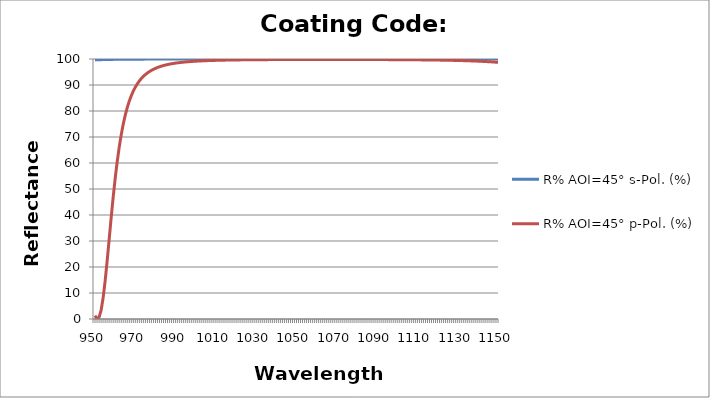
| Category | R% AOI=45° s-Pol. (%) | R% AOI=45° p-Pol. (%) |
|---|---|---|
| 950.0 | 99.659 | 1.313 |
| 951.0 | 99.693 | 0.078 |
| 952.0 | 99.723 | 0.639 |
| 953.0 | 99.749 | 3.265 |
| 954.0 | 99.772 | 7.958 |
| 955.0 | 99.793 | 14.423 |
| 956.0 | 99.811 | 22.128 |
| 957.0 | 99.827 | 30.446 |
| 958.0 | 99.842 | 38.796 |
| 959.0 | 99.854 | 46.736 |
| 960.0 | 99.866 | 53.988 |
| 961.0 | 99.876 | 60.426 |
| 962.0 | 99.886 | 66.026 |
| 963.0 | 99.894 | 70.831 |
| 964.0 | 99.902 | 74.921 |
| 965.0 | 99.909 | 78.384 |
| 966.0 | 99.915 | 81.311 |
| 967.0 | 99.921 | 83.784 |
| 968.0 | 99.926 | 85.877 |
| 969.0 | 99.931 | 87.652 |
| 970.0 | 99.935 | 89.16 |
| 971.0 | 99.939 | 90.447 |
| 972.0 | 99.943 | 91.549 |
| 973.0 | 99.946 | 92.495 |
| 974.0 | 99.95 | 93.312 |
| 975.0 | 99.952 | 94.018 |
| 976.0 | 99.955 | 94.631 |
| 977.0 | 99.958 | 95.166 |
| 978.0 | 99.96 | 95.634 |
| 979.0 | 99.962 | 96.045 |
| 980.0 | 99.964 | 96.406 |
| 981.0 | 99.966 | 96.726 |
| 982.0 | 99.967 | 97.009 |
| 983.0 | 99.969 | 97.26 |
| 984.0 | 99.97 | 97.485 |
| 985.0 | 99.972 | 97.685 |
| 986.0 | 99.973 | 97.864 |
| 987.0 | 99.974 | 98.026 |
| 988.0 | 99.975 | 98.171 |
| 989.0 | 99.976 | 98.302 |
| 990.0 | 99.977 | 98.42 |
| 991.0 | 99.978 | 98.527 |
| 992.0 | 99.979 | 98.625 |
| 993.0 | 99.98 | 98.714 |
| 994.0 | 99.981 | 98.794 |
| 995.0 | 99.981 | 98.868 |
| 996.0 | 99.982 | 98.936 |
| 997.0 | 99.983 | 98.998 |
| 998.0 | 99.983 | 99.055 |
| 999.0 | 99.984 | 99.107 |
| 1000.0 | 99.984 | 99.156 |
| 1001.0 | 99.985 | 99.2 |
| 1002.0 | 99.985 | 99.241 |
| 1003.0 | 99.986 | 99.279 |
| 1004.0 | 99.986 | 99.314 |
| 1005.0 | 99.987 | 99.347 |
| 1006.0 | 99.987 | 99.377 |
| 1007.0 | 99.987 | 99.405 |
| 1008.0 | 99.988 | 99.431 |
| 1009.0 | 99.988 | 99.456 |
| 1010.0 | 99.988 | 99.478 |
| 1011.0 | 99.989 | 99.5 |
| 1012.0 | 99.989 | 99.52 |
| 1013.0 | 99.989 | 99.538 |
| 1014.0 | 99.99 | 99.555 |
| 1015.0 | 99.99 | 99.572 |
| 1016.0 | 99.99 | 99.587 |
| 1017.0 | 99.99 | 99.601 |
| 1018.0 | 99.99 | 99.615 |
| 1019.0 | 99.991 | 99.627 |
| 1020.0 | 99.991 | 99.639 |
| 1021.0 | 99.991 | 99.65 |
| 1022.0 | 99.991 | 99.661 |
| 1023.0 | 99.991 | 99.671 |
| 1024.0 | 99.992 | 99.68 |
| 1025.0 | 99.992 | 99.689 |
| 1026.0 | 99.992 | 99.697 |
| 1027.0 | 99.992 | 99.705 |
| 1028.0 | 99.992 | 99.712 |
| 1029.0 | 99.992 | 99.719 |
| 1030.0 | 99.992 | 99.726 |
| 1031.0 | 99.992 | 99.732 |
| 1032.0 | 99.992 | 99.738 |
| 1033.0 | 99.993 | 99.743 |
| 1034.0 | 99.993 | 99.749 |
| 1035.0 | 99.993 | 99.754 |
| 1036.0 | 99.993 | 99.758 |
| 1037.0 | 99.993 | 99.763 |
| 1038.0 | 99.993 | 99.767 |
| 1039.0 | 99.993 | 99.771 |
| 1040.0 | 99.993 | 99.774 |
| 1041.0 | 99.993 | 99.778 |
| 1042.0 | 99.993 | 99.781 |
| 1043.0 | 99.993 | 99.784 |
| 1044.0 | 99.994 | 99.787 |
| 1045.0 | 99.994 | 99.79 |
| 1046.0 | 99.994 | 99.792 |
| 1047.0 | 99.994 | 99.794 |
| 1048.0 | 99.994 | 99.797 |
| 1049.0 | 99.994 | 99.799 |
| 1050.0 | 99.994 | 99.8 |
| 1051.0 | 99.994 | 99.802 |
| 1052.0 | 99.994 | 99.804 |
| 1053.0 | 99.994 | 99.805 |
| 1054.0 | 99.994 | 99.807 |
| 1055.0 | 99.994 | 99.808 |
| 1056.0 | 99.994 | 99.809 |
| 1057.0 | 99.994 | 99.81 |
| 1058.0 | 99.994 | 99.811 |
| 1059.0 | 99.994 | 99.811 |
| 1060.0 | 99.994 | 99.812 |
| 1061.0 | 99.994 | 99.812 |
| 1062.0 | 99.994 | 99.813 |
| 1063.0 | 99.994 | 99.813 |
| 1064.0 | 99.994 | 99.813 |
| 1065.0 | 99.994 | 99.813 |
| 1066.0 | 99.994 | 99.813 |
| 1067.0 | 99.994 | 99.813 |
| 1068.0 | 99.994 | 99.813 |
| 1069.0 | 99.994 | 99.812 |
| 1070.0 | 99.994 | 99.812 |
| 1071.0 | 99.994 | 99.812 |
| 1072.0 | 99.994 | 99.811 |
| 1073.0 | 99.994 | 99.81 |
| 1074.0 | 99.994 | 99.809 |
| 1075.0 | 99.994 | 99.808 |
| 1076.0 | 99.994 | 99.807 |
| 1077.0 | 99.994 | 99.806 |
| 1078.0 | 99.994 | 99.804 |
| 1079.0 | 99.994 | 99.803 |
| 1080.0 | 99.994 | 99.801 |
| 1081.0 | 99.994 | 99.8 |
| 1082.0 | 99.994 | 99.798 |
| 1083.0 | 99.994 | 99.796 |
| 1084.0 | 99.994 | 99.794 |
| 1085.0 | 99.994 | 99.791 |
| 1086.0 | 99.994 | 99.789 |
| 1087.0 | 99.994 | 99.786 |
| 1088.0 | 99.994 | 99.784 |
| 1089.0 | 99.993 | 99.781 |
| 1090.0 | 99.993 | 99.778 |
| 1091.0 | 99.993 | 99.775 |
| 1092.0 | 99.993 | 99.772 |
| 1093.0 | 99.993 | 99.768 |
| 1094.0 | 99.993 | 99.765 |
| 1095.0 | 99.993 | 99.761 |
| 1096.0 | 99.993 | 99.757 |
| 1097.0 | 99.993 | 99.753 |
| 1098.0 | 99.993 | 99.748 |
| 1099.0 | 99.993 | 99.744 |
| 1100.0 | 99.993 | 99.739 |
| 1101.0 | 99.993 | 99.734 |
| 1102.0 | 99.992 | 99.728 |
| 1103.0 | 99.992 | 99.723 |
| 1104.0 | 99.992 | 99.717 |
| 1105.0 | 99.992 | 99.711 |
| 1106.0 | 99.992 | 99.704 |
| 1107.0 | 99.992 | 99.698 |
| 1108.0 | 99.992 | 99.692 |
| 1109.0 | 99.992 | 99.685 |
| 1110.0 | 99.992 | 99.677 |
| 1111.0 | 99.992 | 99.67 |
| 1112.0 | 99.991 | 99.662 |
| 1113.0 | 99.991 | 99.654 |
| 1114.0 | 99.991 | 99.645 |
| 1115.0 | 99.991 | 99.636 |
| 1116.0 | 99.991 | 99.626 |
| 1117.0 | 99.991 | 99.616 |
| 1118.0 | 99.99 | 99.605 |
| 1119.0 | 99.99 | 99.594 |
| 1120.0 | 99.99 | 99.583 |
| 1121.0 | 99.99 | 99.571 |
| 1122.0 | 99.99 | 99.558 |
| 1123.0 | 99.99 | 99.544 |
| 1124.0 | 99.989 | 99.53 |
| 1125.0 | 99.989 | 99.516 |
| 1126.0 | 99.989 | 99.5 |
| 1127.0 | 99.989 | 99.484 |
| 1128.0 | 99.989 | 99.467 |
| 1129.0 | 99.988 | 99.449 |
| 1130.0 | 99.988 | 99.43 |
| 1131.0 | 99.988 | 99.41 |
| 1132.0 | 99.988 | 99.389 |
| 1133.0 | 99.987 | 99.366 |
| 1134.0 | 99.987 | 99.343 |
| 1135.0 | 99.987 | 99.318 |
| 1136.0 | 99.986 | 99.292 |
| 1137.0 | 99.986 | 99.264 |
| 1138.0 | 99.986 | 99.235 |
| 1139.0 | 99.985 | 99.204 |
| 1140.0 | 99.985 | 99.172 |
| 1141.0 | 99.985 | 99.137 |
| 1142.0 | 99.984 | 99.101 |
| 1143.0 | 99.984 | 99.062 |
| 1144.0 | 99.984 | 99.021 |
| 1145.0 | 99.983 | 98.977 |
| 1146.0 | 99.983 | 98.931 |
| 1147.0 | 99.982 | 98.881 |
| 1148.0 | 99.982 | 98.829 |
| 1149.0 | 99.981 | 98.773 |
| 1150.0 | 99.98 | 98.713 |